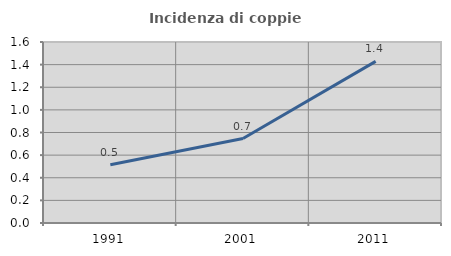
| Category | Incidenza di coppie miste |
|---|---|
| 1991.0 | 0.514 |
| 2001.0 | 0.746 |
| 2011.0 | 1.429 |